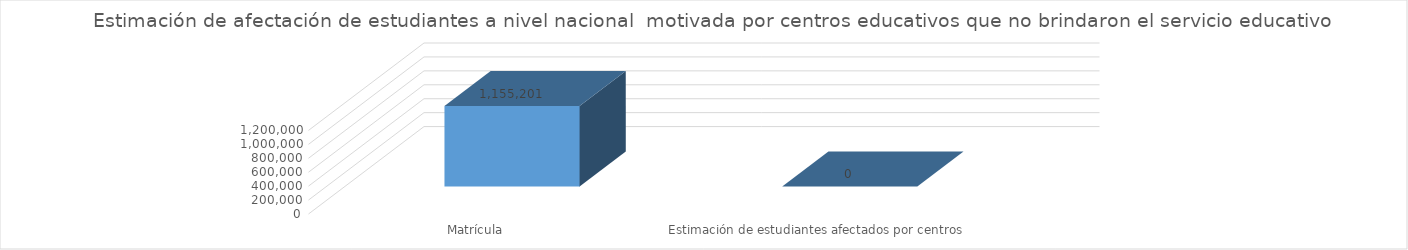
| Category | Series 0 |
|---|---|
| Matrícula | 1155201 |
| Estimación de estudiantes afectados por centros educativos que no lograron implementardar el servicio
 | 0 |